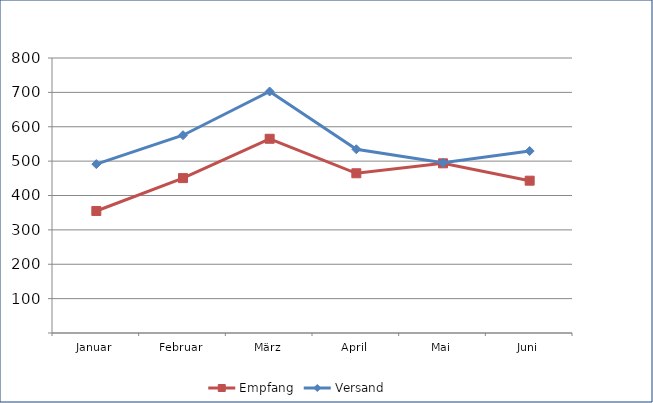
| Category | Empfang | Versand |
|---|---|---|
| Januar | 354.972 | 491.304 |
| Februar | 450.591 | 575.349 |
| März | 565.042 | 702.524 |
| April | 464.652 | 534.457 |
| Mai | 493.598 | 495.221 |
| Juni | 443.094 | 529.404 |